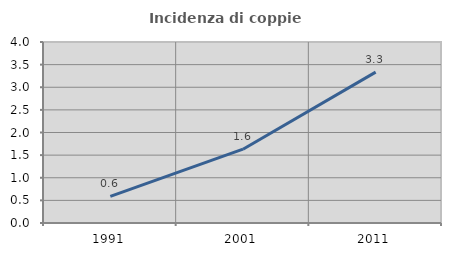
| Category | Incidenza di coppie miste |
|---|---|
| 1991.0 | 0.589 |
| 2001.0 | 1.632 |
| 2011.0 | 3.335 |